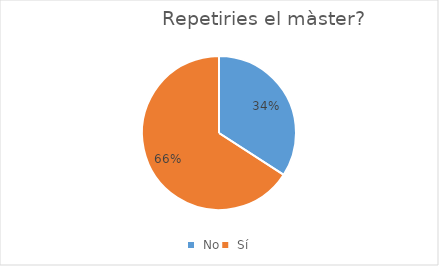
| Category | Series 0 |
|---|---|
|  No | 72 |
|  Sí | 139 |